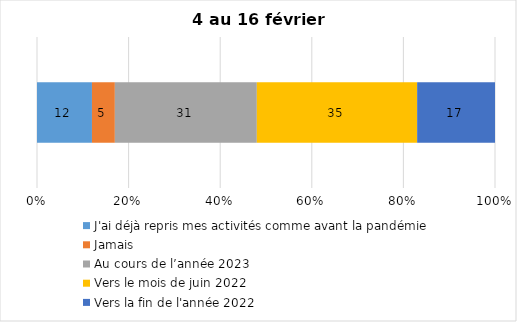
| Category | J'ai déjà repris mes activités comme avant la pandémie | Jamais | Au cours de l’année 2023 | Vers le mois de juin 2022 | Vers la fin de l'année 2022 |
|---|---|---|---|---|---|
| 0 | 12 | 5 | 31 | 35 | 17 |